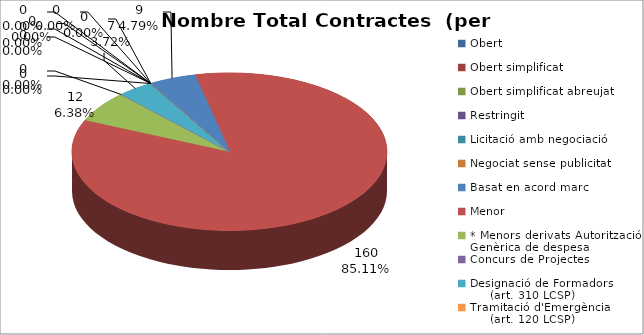
| Category | Nombre Total Contractes |
|---|---|
| Obert | 0 |
| Obert simplificat | 0 |
| Obert simplificat abreujat | 0 |
| Restringit | 0 |
| Licitació amb negociació | 0 |
| Negociat sense publicitat | 0 |
| Basat en acord marc | 9 |
| Menor | 160 |
| * Menors derivats Autorització Genèrica de despesa | 12 |
| Concurs de Projectes | 0 |
| Designació de Formadors
     (art. 310 LCSP) | 7 |
| Tramitació d'Emergència
     (art. 120 LCSP) | 0 |